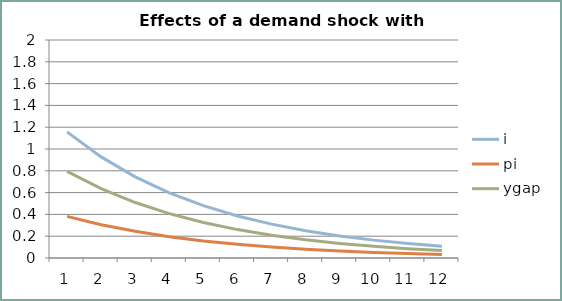
| Category | i | pi | ygap |
|---|---|---|---|
| 0 | 1.157 | 0.382 | 0.795 |
| 1 | 0.928 | 0.306 | 0.636 |
| 2 | 0.744 | 0.245 | 0.509 |
| 3 | 0.597 | 0.196 | 0.407 |
| 4 | 0.48 | 0.157 | 0.326 |
| 5 | 0.386 | 0.125 | 0.261 |
| 6 | 0.311 | 0.1 | 0.208 |
| 7 | 0.251 | 0.08 | 0.167 |
| 8 | 0.203 | 0.064 | 0.133 |
| 9 | 0.164 | 0.051 | 0.107 |
| 10 | 0.133 | 0.041 | 0.085 |
| 11 | 0.109 | 0.033 | 0.068 |